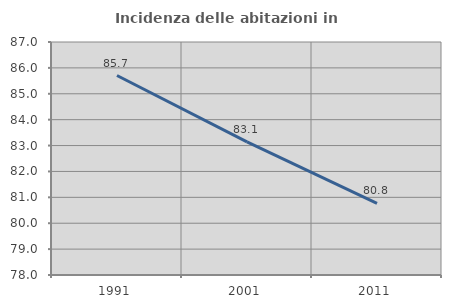
| Category | Incidenza delle abitazioni in proprietà  |
|---|---|
| 1991.0 | 85.706 |
| 2001.0 | 83.14 |
| 2011.0 | 80.769 |